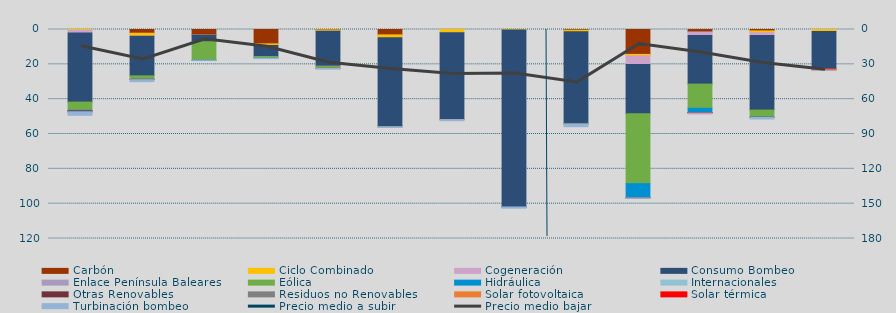
| Category | Carbón | Ciclo Combinado | Cogeneración | Consumo Bombeo | Enlace Península Baleares | Eólica | Hidráulica | Internacionales | Otras Renovables | Residuos no Renovables | Solar fotovoltaica | Solar térmica | Turbinación bombeo |
|---|---|---|---|---|---|---|---|---|---|---|---|---|---|
| 0 | 0 | 570.5 | 1413.2 | 39702.4 | 0 | 4712.9 | 426.9 |  | 339.1 | 87.1 | 9.1 | 19.1 | 1985.9 |
| 1 | 2132.8 | 1653.1 | 89.7 | 22758.3 | 0 | 1839.6 | 206.1 |  | 0 | 0 | 8.2 | 112.5 | 1136.7 |
| 2 | 3265.4 | 16.7 | 18.4 | 3709.8 | 0 | 10611 | 1.6 |  | 0 | 0 | 0 | 0 | 36.6 |
| 3 | 8244.2 | 904.8 | 2.7 | 6336.3 | 0 | 978.8 | 40 |  | 0 | 0 | 0 | 0 | 211.7 |
| 4 | 208.4 | 783.8 | 39.5 | 20030 | 213.5 | 1049.8 | 0 |  | 0 | 0 | 0 | 34.2 | 399.9 |
| 5 | 3100.2 | 1575.6 | 0 | 51191.5 | 0 | 12.5 | 0 |  | 0 | 0 | 0 | 0 | 347.6 |
| 6 | 0 | 1898.2 | 24.2 | 49736.3 | 0 | 105.1 | 0 |  | 0 | 0 | 0.1 | 0 | 619.4 |
| 7 | 0 | 331 | 0 | 101506.1 | 204 | 0 | 106.7 |  | 0 | 0 | 0 | 0 | 462.2 |
| 8 | 376.2 | 910.9 | 0 | 52921.9 | 0 | 42.8 | 0 |  | 0 | 0 | 0 | 0 | 1542.2 |
| 9 | 14289.6 | 859.1 | 4972 | 28184.1 | 0 | 40219.4 | 7988.8 |  | 49.4 | 240.8 | 0 | 0 | 110.8 |
| 10 | 1420.9 | 0 | 2021.5 | 27920 | 0 | 13875.8 | 2396.1 |  | 21.7 | 98.3 | 0 | 224.2 | 474.7 |
| 11 | 808.2 | 1016.6 | 1618.6 | 42815.3 | 0 | 4070.8 | 105.9 |  | 51.2 | 12.8 | 0 | 0 | 879 |
| 12 | 0 | 1097.9 | 0 | 21404.4 | 0 | 137.4 | 0 |  | 0 | 0 | 0 | 518.8 | 108.8 |